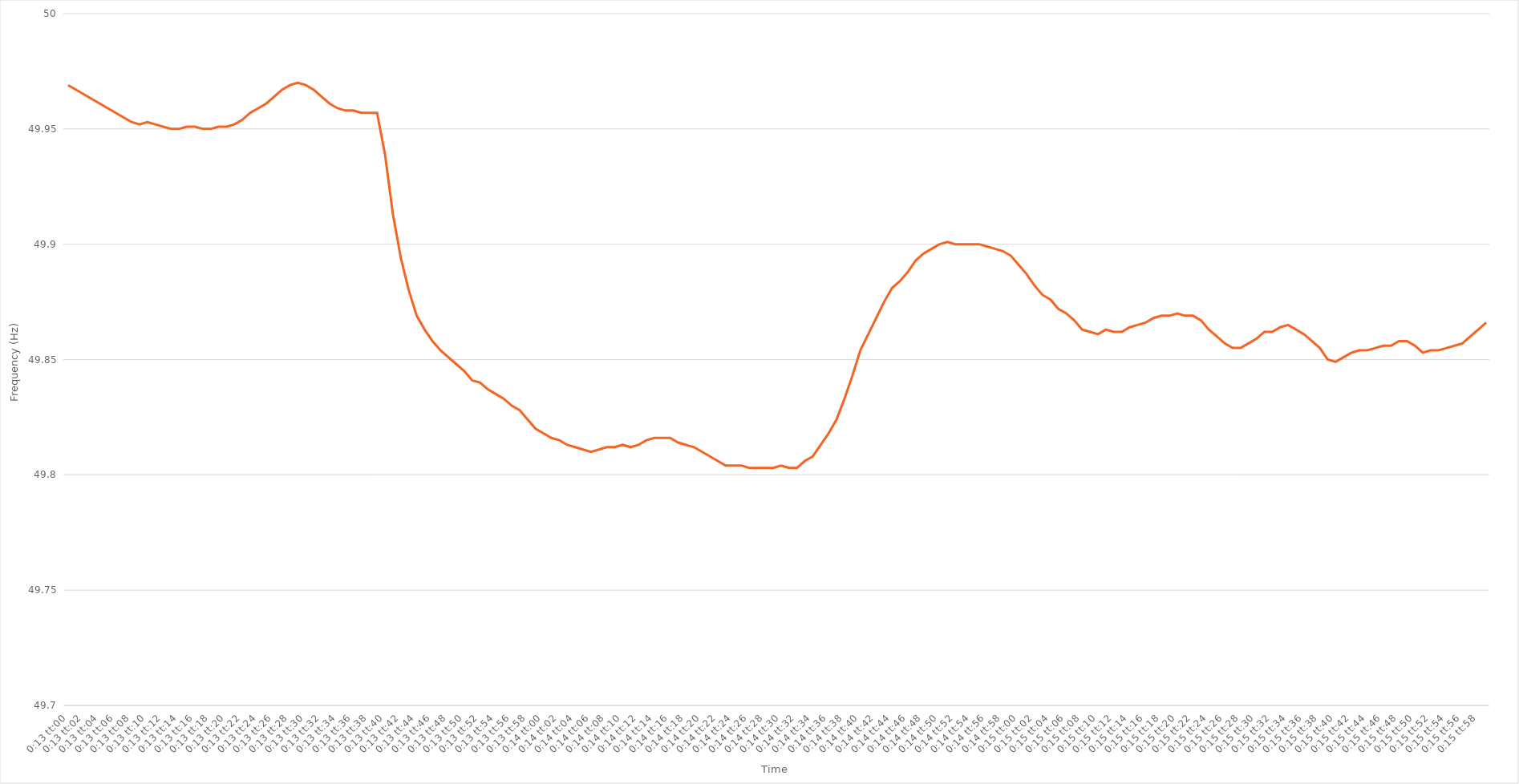
| Category | Series 0 |
|---|---|
| 0.009027777777777779 | 49.969 |
| 0.009039351851851852 | 49.967 |
| 0.009050925925925926 | 49.965 |
| 0.0090625 | 49.963 |
| 0.009074074074074073 | 49.961 |
| 0.009085648148148148 | 49.959 |
| 0.009097222222222222 | 49.957 |
| 0.009108796296296297 | 49.955 |
| 0.00912037037037037 | 49.953 |
| 0.009131944444444444 | 49.952 |
| 0.009143518518518518 | 49.953 |
| 0.009155092592592593 | 49.952 |
| 0.009166666666666667 | 49.951 |
| 0.00917824074074074 | 49.95 |
| 0.009189814814814814 | 49.95 |
| 0.00920138888888889 | 49.951 |
| 0.009212962962962963 | 49.951 |
| 0.009224537037037036 | 49.95 |
| 0.009236111111111112 | 49.95 |
| 0.009247685185185185 | 49.951 |
| 0.00925925925925926 | 49.951 |
| 0.009270833333333334 | 49.952 |
| 0.009282407407407408 | 49.954 |
| 0.009293981481481481 | 49.957 |
| 0.009305555555555555 | 49.959 |
| 0.009317129629629628 | 49.961 |
| 0.009328703703703704 | 49.964 |
| 0.009340277777777777 | 49.967 |
| 0.009351851851851853 | 49.969 |
| 0.009363425925925926 | 49.97 |
| 0.009375 | 49.969 |
| 0.009386574074074075 | 49.967 |
| 0.009398148148148149 | 49.964 |
| 0.009409722222222224 | 49.961 |
| 0.009421296296296296 | 49.959 |
| 0.009432870370370371 | 49.958 |
| 0.009444444444444445 | 49.958 |
| 0.009456018518518518 | 49.957 |
| 0.009467592592592592 | 49.957 |
| 0.009479166666666667 | 49.957 |
| 0.00949074074074074 | 49.939 |
| 0.009502314814814816 | 49.913 |
| 0.00951388888888889 | 49.894 |
| 0.009525462962962963 | 49.88 |
| 0.009537037037037037 | 49.869 |
| 0.00954861111111111 | 49.863 |
| 0.009560185185185185 | 49.858 |
| 0.009571759259259259 | 49.854 |
| 0.009583333333333334 | 49.851 |
| 0.009594907407407408 | 49.848 |
| 0.009606481481481481 | 49.845 |
| 0.009618055555555555 | 49.841 |
| 0.00962962962962963 | 49.84 |
| 0.009641203703703704 | 49.837 |
| 0.009652777777777777 | 49.835 |
| 0.009664351851851851 | 49.833 |
| 0.009675925925925926 | 49.83 |
| 0.0096875 | 49.828 |
| 0.009699074074074074 | 49.824 |
| 0.009710648148148147 | 49.82 |
| 0.009722222222222222 | 49.818 |
| 0.009733796296296298 | 49.816 |
| 0.009745370370370371 | 49.815 |
| 0.009756944444444445 | 49.813 |
| 0.009768518518518518 | 49.812 |
| 0.009780092592592592 | 49.811 |
| 0.009791666666666666 | 49.81 |
| 0.00980324074074074 | 49.811 |
| 0.009814814814814814 | 49.812 |
| 0.00982638888888889 | 49.812 |
| 0.009837962962962963 | 49.813 |
| 0.009849537037037037 | 49.812 |
| 0.00986111111111111 | 49.813 |
| 0.009872685185185186 | 49.815 |
| 0.009884259259259258 | 49.816 |
| 0.009895833333333333 | 49.816 |
| 0.009907407407407408 | 49.816 |
| 0.009918981481481482 | 49.814 |
| 0.009930555555555555 | 49.813 |
| 0.009942129629629629 | 49.812 |
| 0.009953703703703704 | 49.81 |
| 0.009965277777777778 | 49.808 |
| 0.009976851851851853 | 49.806 |
| 0.009988425925925927 | 49.804 |
| 0.01 | 49.804 |
| 0.010011574074074074 | 49.804 |
| 0.010023148148148147 | 49.803 |
| 0.010034722222222221 | 49.803 |
| 0.010046296296296296 | 49.803 |
| 0.01005787037037037 | 49.803 |
| 0.010069444444444445 | 49.804 |
| 0.010081018518518519 | 49.803 |
| 0.010092592592592592 | 49.803 |
| 0.010104166666666668 | 49.806 |
| 0.010115740740740741 | 49.808 |
| 0.010127314814814815 | 49.813 |
| 0.010138888888888888 | 49.818 |
| 0.010150462962962964 | 49.824 |
| 0.010162037037037037 | 49.833 |
| 0.01017361111111111 | 49.843 |
| 0.010185185185185184 | 49.854 |
| 0.01019675925925926 | 49.861 |
| 0.010208333333333333 | 49.868 |
| 0.010219907407407408 | 49.875 |
| 0.010231481481481482 | 49.881 |
| 0.010243055555555556 | 49.884 |
| 0.01025462962962963 | 49.888 |
| 0.010266203703703703 | 49.893 |
| 0.010277777777777778 | 49.896 |
| 0.010289351851851852 | 49.898 |
| 0.010300925925925927 | 49.9 |
| 0.0103125 | 49.901 |
| 0.010324074074074074 | 49.9 |
| 0.010335648148148148 | 49.9 |
| 0.010347222222222223 | 49.9 |
| 0.010358796296296295 | 49.9 |
| 0.01037037037037037 | 49.899 |
| 0.010381944444444444 | 49.898 |
| 0.010393518518518519 | 49.897 |
| 0.010405092592592593 | 49.895 |
| 0.010416666666666666 | 49.891 |
| 0.01042824074074074 | 49.887 |
| 0.010439814814814813 | 49.882 |
| 0.01045138888888889 | 49.878 |
| 0.010462962962962964 | 49.876 |
| 0.010474537037037037 | 49.872 |
| 0.010486111111111111 | 49.87 |
| 0.010497685185185186 | 49.867 |
| 0.01050925925925926 | 49.863 |
| 0.010520833333333333 | 49.862 |
| 0.010532407407407407 | 49.861 |
| 0.01054398148148148 | 49.863 |
| 0.010555555555555554 | 49.862 |
| 0.01056712962962963 | 49.862 |
| 0.010578703703703703 | 49.864 |
| 0.010590277777777777 | 49.865 |
| 0.010601851851851854 | 49.866 |
| 0.010613425925925927 | 49.868 |
| 0.010625 | 49.869 |
| 0.010636574074074074 | 49.869 |
| 0.01064814814814815 | 49.87 |
| 0.010659722222222221 | 49.869 |
| 0.010671296296296297 | 49.869 |
| 0.01068287037037037 | 49.867 |
| 0.010694444444444444 | 49.863 |
| 0.010706018518518517 | 49.86 |
| 0.010717592592592593 | 49.857 |
| 0.010729166666666666 | 49.855 |
| 0.01074074074074074 | 49.855 |
| 0.010752314814814814 | 49.857 |
| 0.01076388888888889 | 49.859 |
| 0.010775462962962964 | 49.862 |
| 0.010787037037037038 | 49.862 |
| 0.010798611111111111 | 49.864 |
| 0.010810185185185185 | 49.865 |
| 0.01082175925925926 | 49.863 |
| 0.010833333333333334 | 49.861 |
| 0.010844907407407407 | 49.858 |
| 0.01085648148148148 | 49.855 |
| 0.010868055555555556 | 49.85 |
| 0.01087962962962963 | 49.849 |
| 0.010891203703703703 | 49.851 |
| 0.010902777777777777 | 49.853 |
| 0.01091435185185185 | 49.854 |
| 0.010925925925925924 | 49.854 |
| 0.010937500000000001 | 49.855 |
| 0.010949074074074075 | 49.856 |
| 0.010960648148148148 | 49.856 |
| 0.010972222222222223 | 49.858 |
| 0.010983796296296297 | 49.858 |
| 0.01099537037037037 | 49.856 |
| 0.011006944444444444 | 49.853 |
| 0.011018518518518518 | 49.854 |
| 0.011030092592592591 | 49.854 |
| 0.011041666666666667 | 49.855 |
| 0.01105324074074074 | 49.856 |
| 0.011064814814814814 | 49.857 |
| 0.011076388888888887 | 49.86 |
| 0.011087962962962964 | 49.863 |
| 0.011099537037037038 | 49.866 |